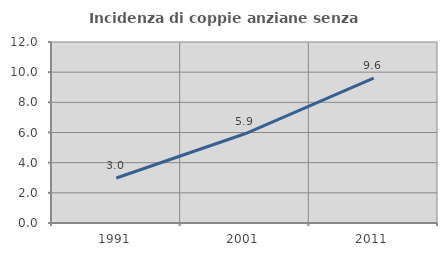
| Category | Incidenza di coppie anziane senza figli  |
|---|---|
| 1991.0 | 2.983 |
| 2001.0 | 5.917 |
| 2011.0 | 9.597 |